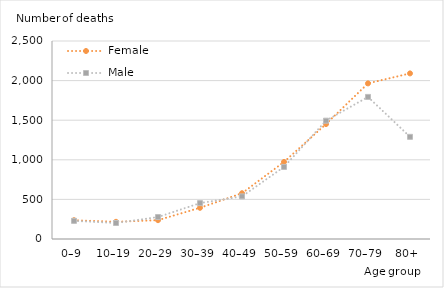
| Category | Female | Male |
|---|---|---|
| 0–9 | 237 | 229 |
| 10–19 | 217 | 202 |
| 20–29 | 238 | 277 |
| 30–39 | 394 | 453 |
| 40–49 | 578 | 538 |
| 50–59 | 973 | 910 |
| 60–69 | 1451 | 1494 |
| 70–79 | 1965 | 1794 |
| 80+ | 2091 | 1290 |